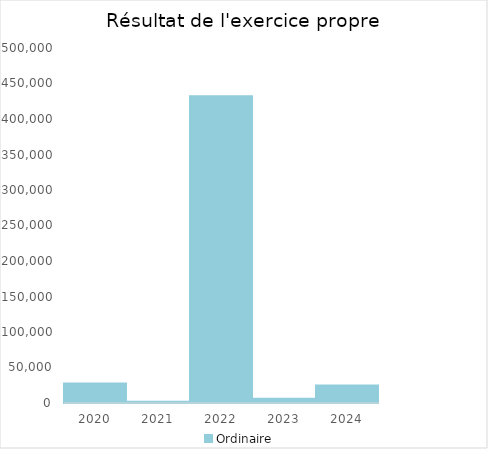
| Category |   | Ordinaire |    |
|---|---|---|---|
| 2020.0 |  | 27382.06 |  |
| 2021.0 |  | 1777.48 |  |
| 2022.0 |  | 431884.79 |  |
| 2023.0 |  | 5913.19 |  |
| 2024.0 |  | 24472.51 |  |